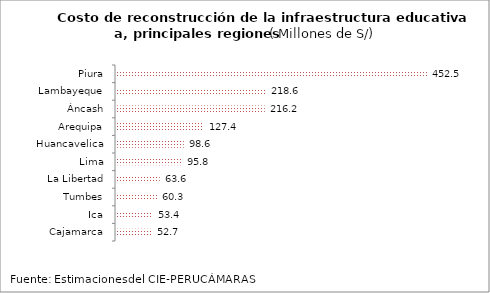
| Category | Series 0 |
|---|---|
| Piura | 452.532 |
| Lambayeque | 218.588 |
| Áncash | 216.208 |
| Arequipa | 127.428 |
| Huancavelica | 98.564 |
| Lima | 95.844 |
| La Libertad | 63.626 |
| Tumbes | 60.315 |
| Ica | 53.442 |
| Cajamarca | 52.659 |